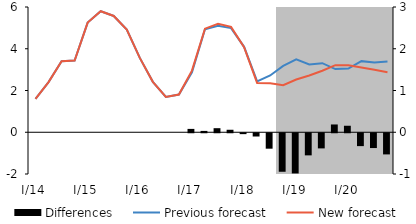
| Category | Differences |
|---|---|
| I/14 | 0 |
| II | 0 |
| III | 0 |
| IV | 0 |
| I/15 | 0 |
| II | 0 |
| III | 0 |
| IV | 0 |
| I/16 | 0 |
| II | 0 |
| III | 0 |
| IV | 0 |
| I/17 | 0.08 |
| II | 0.032 |
| III | 0.097 |
| IV | 0.06 |
| I/18 | -0.021 |
| II | -0.078 |
| III | -0.37 |
| IV | -0.923 |
| I/19 | -0.963 |
| II | -0.53 |
| III | -0.363 |
| IV | 0.186 |
| I/20 | 0.156 |
| II | -0.308 |
| III | -0.354 |
| IV | -0.507 |